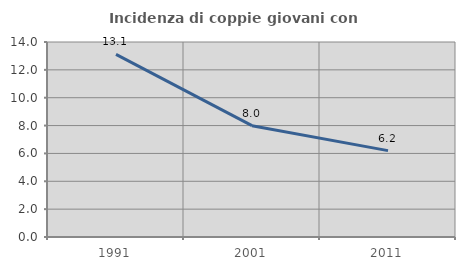
| Category | Incidenza di coppie giovani con figli |
|---|---|
| 1991.0 | 13.109 |
| 2001.0 | 7.994 |
| 2011.0 | 6.201 |